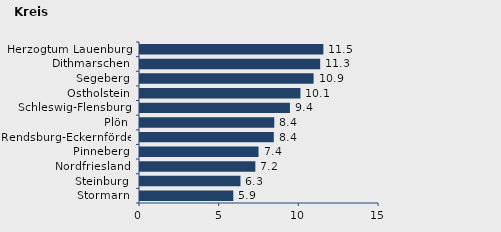
| Category | Wanderungssaldo |
|---|---|
| Stormarn | 5.856 |
| Steinburg | 6.305 |
| Nordfriesland | 7.239 |
| Pinneberg | 7.439 |
| Rendsburg-Eckernförde | 8.397 |
| Plön | 8.428 |
| Schleswig-Flensburg | 9.411 |
| Ostholstein | 10.069 |
| Segeberg | 10.895 |
| Dithmarschen | 11.309 |
| Herzogtum Lauenburg | 11.508 |